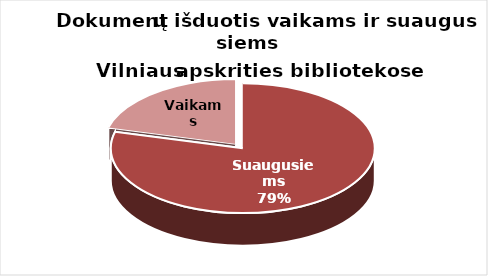
| Category | Series 0 |
|---|---|
| Suaugusiems | 2584289 |
| Vaikams | 684498 |